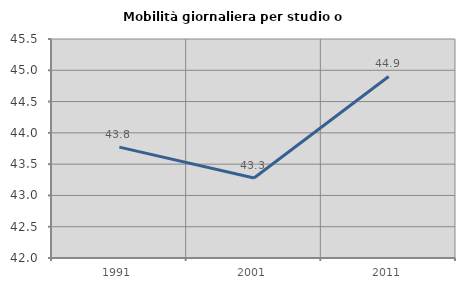
| Category | Mobilità giornaliera per studio o lavoro |
|---|---|
| 1991.0 | 43.772 |
| 2001.0 | 43.279 |
| 2011.0 | 44.901 |